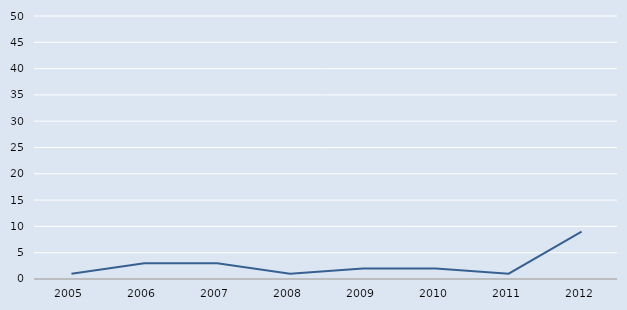
| Category | Series 0 |
|---|---|
| 2005.0 | 1 |
| 2006.0 | 3 |
| 2007.0 | 3 |
| 2008.0 | 1 |
| 2009.0 | 2 |
| 2010.0 | 2 |
| 2011.0 | 1 |
| 2012.0 | 9 |